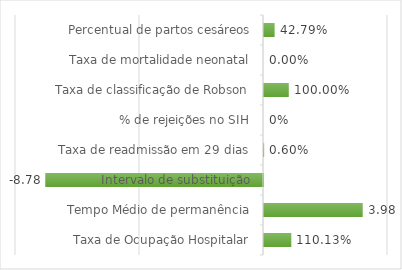
| Category | Series 0 |
|---|---|
| Taxa de Ocupação Hospitalar | 1.101 |
| Tempo Médio de permanência | 3.98 |
| Intervalo de substituição | -8.78 |
| Taxa de readmissão em 29 dias | 0.006 |
| % de rejeições no SIH | 0 |
| Taxa de classificação de Robson | 1 |
| Taxa de mortalidade neonatal | 0 |
| Percentual de partos cesáreos | 0.428 |